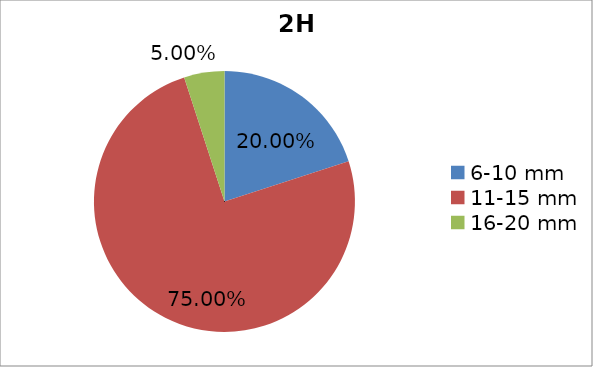
| Category | Series 0 |
|---|---|
| 6-10 mm | 0.2 |
| 11-15 mm | 0.75 |
| 16-20 mm | 0.05 |